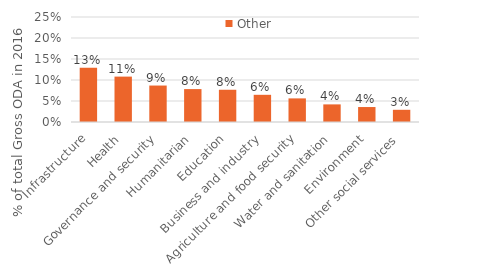
| Category | Other |
|---|---|
| Infrastructure | 0.129 |
| Health | 0.108 |
| Governance and security | 0.087 |
| Humanitarian | 0.078 |
| Education | 0.077 |
| Business and industry | 0.065 |
| Agriculture and food security | 0.056 |
| Water and sanitation | 0.042 |
| Environment | 0.036 |
| Other social services | 0.029 |